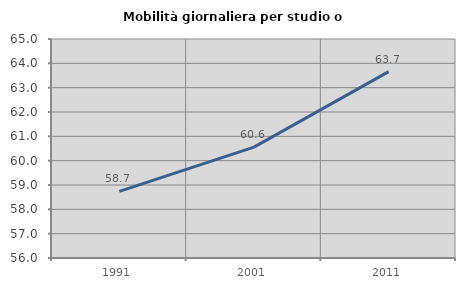
| Category | Mobilità giornaliera per studio o lavoro |
|---|---|
| 1991.0 | 58.735 |
| 2001.0 | 60.558 |
| 2011.0 | 63.657 |